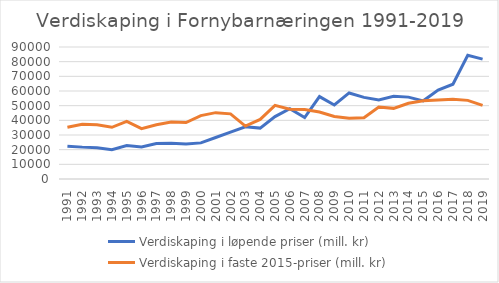
| Category | Verdiskaping i løpende priser (mill. kr) | Verdiskaping i faste 2015-priser (mill. kr) |
|---|---|---|
| 1991.0 | 22396 | 35319 |
| 1992.0 | 21732 | 37314 |
| 1993.0 | 21316 | 37001 |
| 1994.0 | 20014 | 35264 |
| 1995.0 | 22795 | 39221 |
| 1996.0 | 21861 | 34326 |
| 1997.0 | 24249 | 36995 |
| 1998.0 | 24435 | 38803 |
| 1999.0 | 23797 | 38517 |
| 2000.0 | 24633 | 43227 |
| 2001.0 | 28298 | 45237 |
| 2002.0 | 32008 | 44402 |
| 2003.0 | 35576 | 36097 |
| 2004.0 | 34705 | 40622 |
| 2005.0 | 42540 | 50247 |
| 2006.0 | 47911 | 47549 |
| 2007.0 | 41882 | 47400 |
| 2008.0 | 56199 | 45684 |
| 2009.0 | 50456 | 42676 |
| 2010.0 | 58670 | 41429 |
| 2011.0 | 55652 | 41787 |
| 2012.0 | 53846 | 49133 |
| 2013.0 | 56451 | 48166 |
| 2014.0 | 55823 | 51612 |
| 2015.0 | 53297 | 53297 |
| 2016.0 | 60681 | 53893 |
| 2017.0 | 64646 | 54364 |
| 2018.0 | 84374 | 53609 |
| 2019.0 | 81764 | 50250 |